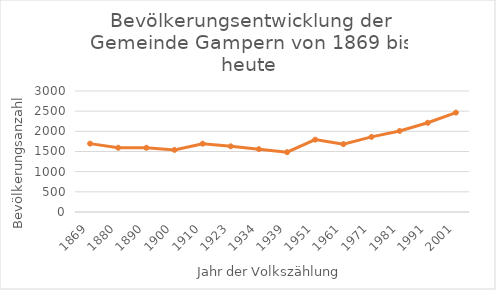
| Category | Series 1 |
|---|---|
| 1869 | 1695 |
| 1880 | 1593 |
| 1890 | 1593 |
| 1900 | 1540 |
| 1910 | 1694 |
| 1923 | 1629 |
| 1934 | 1558 |
| 1939 | 1483 |
| 1951 | 1794 |
| 1961 | 1683 |
| 1971 | 1862 |
| 1981 | 2010 |
| 1991 | 2212 |
| 2001 | 2464 |